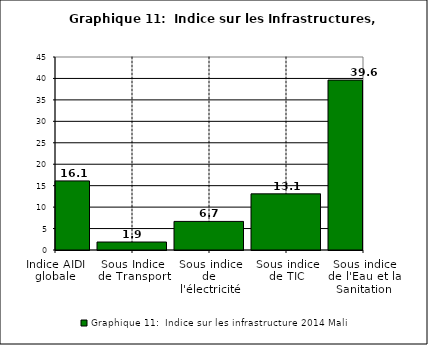
| Category | Graphique 11:  Indice sur les infrastructure 2014 |
|---|---|
| Indice AIDI globale | 16.108 |
| Sous Indice de Transport | 1.859 |
| Sous indice de l'électricité | 6.667 |
| Sous indice de TIC | 13.092 |
| Sous indice de l'Eau et la Sanitation | 39.617 |